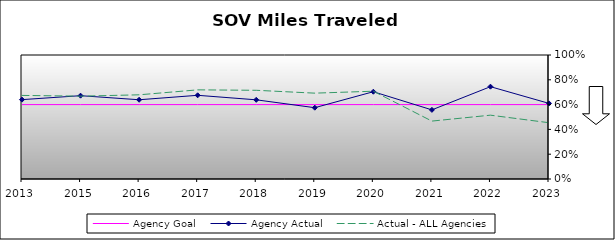
| Category | Agency Goal | Agency Actual | Actual - ALL Agencies |
|---|---|---|---|
| 2013.0 | 0.6 | 0.64 | 0.674 |
| 2015.0 | 0.6 | 0.672 | 0.668 |
| 2016.0 | 0.6 | 0.639 | 0.679 |
| 2017.0 | 0.6 | 0.675 | 0.719 |
| 2018.0 | 0.6 | 0.638 | 0.715 |
| 2019.0 | 0.6 | 0.575 | 0.692 |
| 2020.0 | 0.6 | 0.704 | 0.708 |
| 2021.0 | 0.6 | 0.558 | 0.467 |
| 2022.0 | 0.6 | 0.744 | 0.515 |
| 2023.0 | 0.6 | 0.61 | 0.454 |